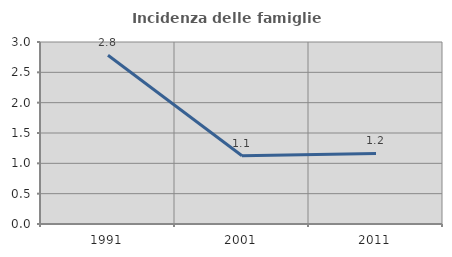
| Category | Incidenza delle famiglie numerose |
|---|---|
| 1991.0 | 2.781 |
| 2001.0 | 1.124 |
| 2011.0 | 1.163 |